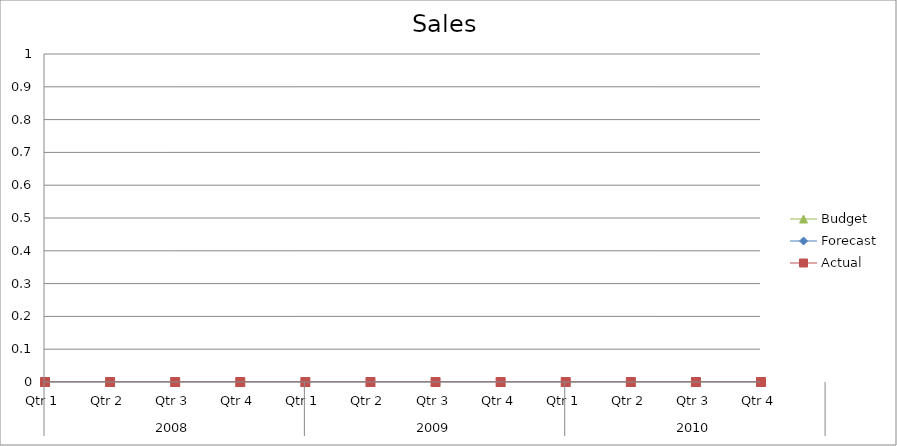
| Category | Budget | Forecast | Actual |
|---|---|---|---|
| 0 | 2060 | 1050 | 2770 |
| 1 | 1040 | 1900 | 620 |
| 2 | 3440 | 2860 | 1450 |
| 3 | 850 | 1700 | 2700 |
| 4 | 1250 | 1000 | 1940 |
| 5 | 1670 | 1630 | 650 |
| 6 | 2110 | 1070 | 3010 |
| 7 | 1140 | 1080 | 2640 |
| 8 | 2130 | 1790 | 2970 |
| 9 | 2170 | 3320 | 1460 |
| 10 | 530 | 2320 | 3010 |
| 11 | 2200 | 2260 | 2210 |